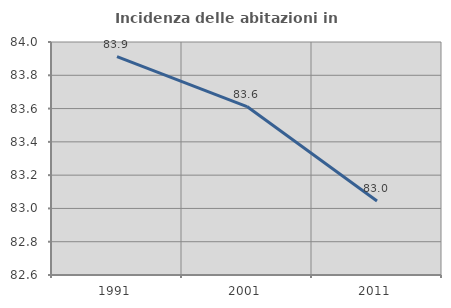
| Category | Incidenza delle abitazioni in proprietà  |
|---|---|
| 1991.0 | 83.912 |
| 2001.0 | 83.612 |
| 2011.0 | 83.045 |